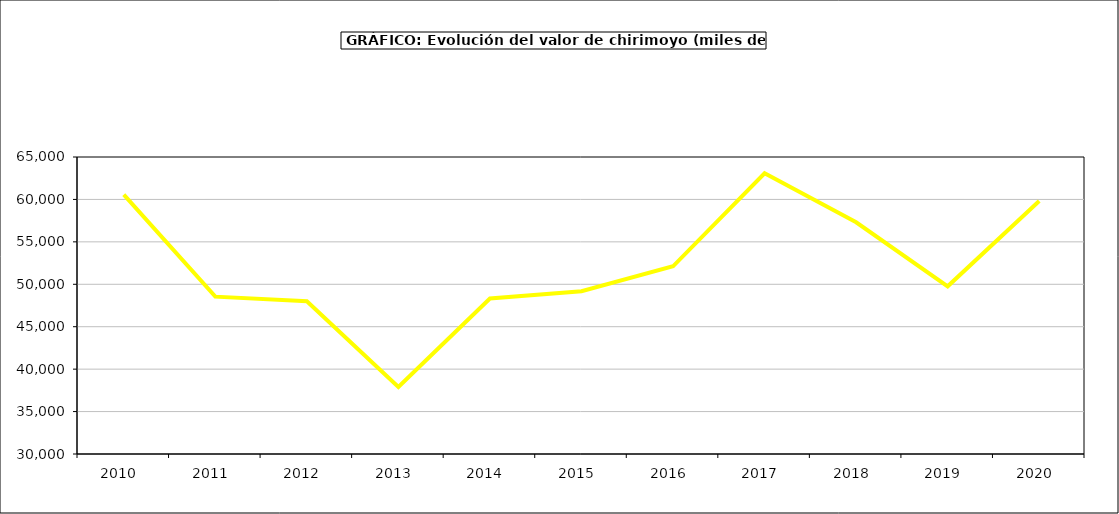
| Category | valor chirimoyo |
|---|---|
| 2010.0 | 60575.574 |
| 2011.0 | 48545.2 |
| 2012.0 | 47992.004 |
| 2013.0 | 37891.803 |
| 2014.0 | 48319.818 |
| 2015.0 | 49187 |
| 2016.0 | 52120 |
| 2017.0 | 63081.583 |
| 2018.0 | 57311.719 |
| 2019.0 | 49759.664 |
| 2020.0 | 59822.325 |